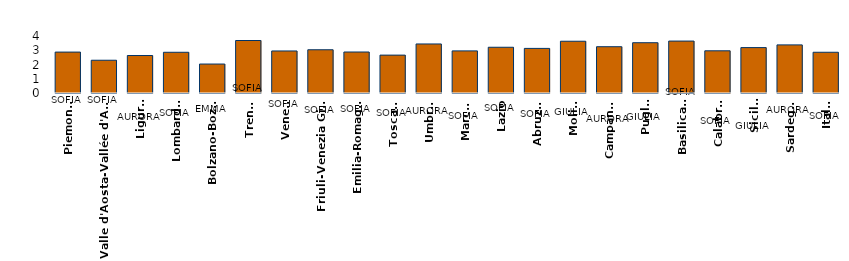
| Category | Nate Femmine |
|---|---|
| Piemonte | 2.872 |
| Valle d'Aosta-Vallée d'Aoste | 2.299 |
| Liguria | 2.63 |
| Lombardia | 2.858 |
| Bolzano-Bozen | 2.033 |
| Trento | 3.684 |
| Veneto | 2.95 |
| Friuli-Venezia Giulia | 3.035 |
| Emilia-Romagna | 2.876 |
| Toscana | 2.658 |
| Umbria | 3.442 |
| Marche | 2.956 |
| Lazio | 3.21 |
| Abruzzo | 3.13 |
| Molise | 3.632 |
| Campania | 3.248 |
| Puglia | 3.529 |
| Basilicata | 3.644 |
| Calabria | 2.961 |
| Sicilia | 3.185 |
| Sardegna | 3.377 |
| Italia | 2.86 |